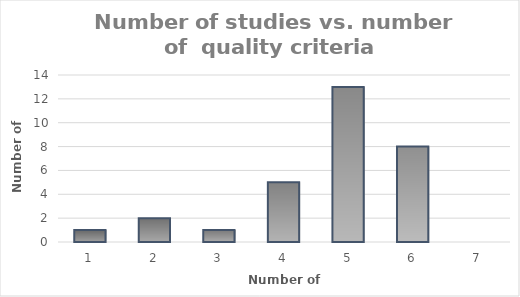
| Category | Series 0 |
|---|---|
| 1.0 | 1 |
| 2.0 | 2 |
| 3.0 | 1 |
| 4.0 | 5 |
| 5.0 | 13 |
| 6.0 | 8 |
| 7.0 | 0 |